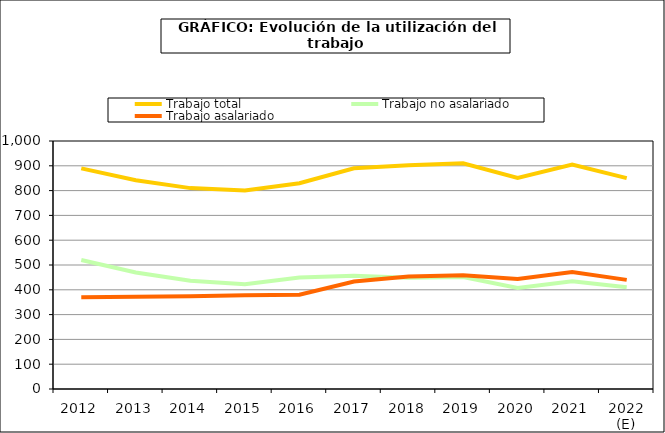
| Category | Trabajo total | Trabajo no asalariado | Trabajo asalariado |
|---|---|---|---|
| 2012 | 889.651 | 520.158 | 369.493 |
| 2013 | 841.68 | 470.11 | 371.57 |
| 2014 | 810.011 | 436.377 | 373.634 |
| 2015 | 800.53 | 422.745 | 377.785 |
| 2016 | 829.51 | 449.21 | 380.3 |
| 2017 | 890.172 | 456.713 | 433.459 |
| 2018 | 902.43 | 448.785 | 453.645 |
| 2019 | 910.089 | 451.89 | 458.199 |
| 2020 | 851.383 | 407.68 | 443.703 |
| 2021 | 905.351 | 433.95 | 471.4 |
| 2022 (E) | 850.287 | 410.339 | 439.949 |